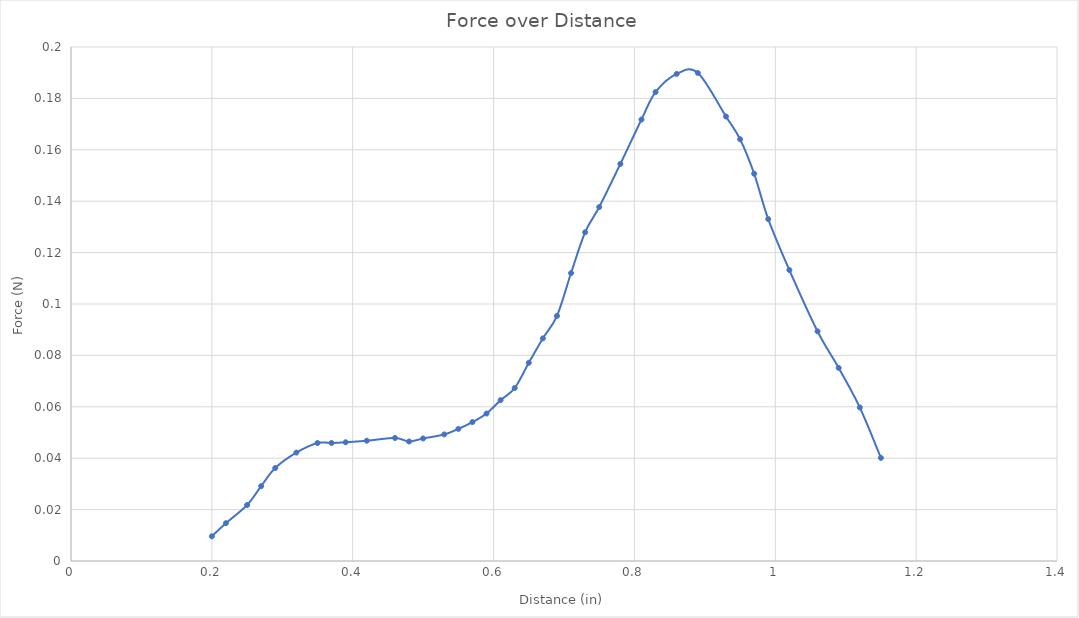
| Category | Force (N) |
|---|---|
| 0.2 | 0.01 |
| 0.22 | 0.015 |
| 0.25 | 0.022 |
| 0.27 | 0.029 |
| 0.29 | 0.036 |
| 0.32 | 0.042 |
| 0.35 | 0.046 |
| 0.37 | 0.046 |
| 0.39 | 0.046 |
| 0.42 | 0.047 |
| 0.46 | 0.048 |
| 0.48 | 0.046 |
| 0.5 | 0.048 |
| 0.53 | 0.049 |
| 0.55 | 0.051 |
| 0.57 | 0.054 |
| 0.59 | 0.057 |
| 0.61 | 0.063 |
| 0.63 | 0.067 |
| 0.65 | 0.077 |
| 0.67 | 0.087 |
| 0.69 | 0.095 |
| 0.71 | 0.112 |
| 0.73 | 0.128 |
| 0.75 | 0.138 |
| 0.78 | 0.155 |
| 0.81 | 0.172 |
| 0.83 | 0.182 |
| 0.86 | 0.19 |
| 0.89 | 0.19 |
| 0.93 | 0.173 |
| 0.95 | 0.164 |
| 0.97 | 0.151 |
| 0.99 | 0.133 |
| 1.02 | 0.113 |
| 1.06 | 0.089 |
| 1.09 | 0.075 |
| 1.12 | 0.06 |
| 1.15 | 0.04 |